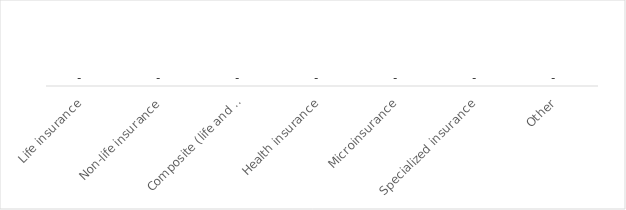
| Category | Series 0 |
|---|---|
| Life insurance | 0 |
| Non-life insurance | 0 |
| Composite (life and non-life) insurance | 0 |
| Health insurance | 0 |
| Microinsurance | 0 |
| Specialized insurance | 0 |
| Other | 0 |